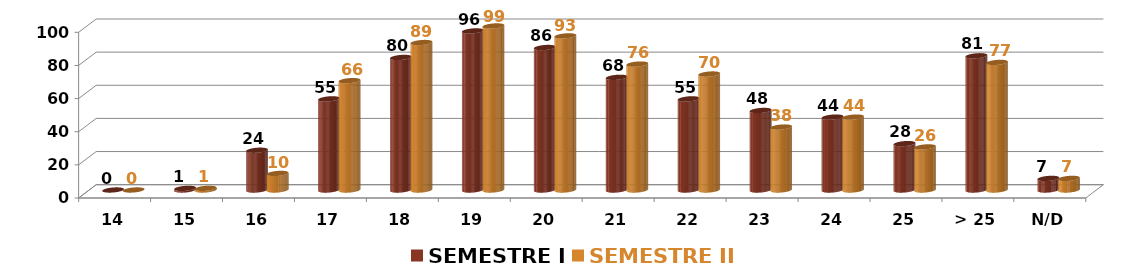
| Category | SEMESTRE I | SEMESTRE II |
|---|---|---|
| 14 | 0 | 0 |
| 15 | 1 | 1 |
| 16 | 24 | 10 |
| 17 | 55 | 66 |
| 18 | 80 | 89 |
| 19 | 96 | 99 |
| 20 | 86 | 93 |
| 21 | 68 | 76 |
| 22 | 55 | 70 |
| 23 | 48 | 38 |
| 24 | 44 | 44 |
| 25 | 28 | 26 |
| > 25 | 81 | 77 |
| N/D | 7 | 7 |